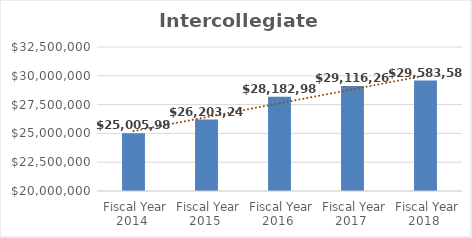
| Category | Intercollegiate Athletics |
|---|---|
| Fiscal Year 2014 | 25005983 |
| Fiscal Year 2015 | 26203245 |
| Fiscal Year 2016 | 28182988 |
| Fiscal Year 2017 | 29116261 |
| Fiscal Year 2018 | 29583585.59 |